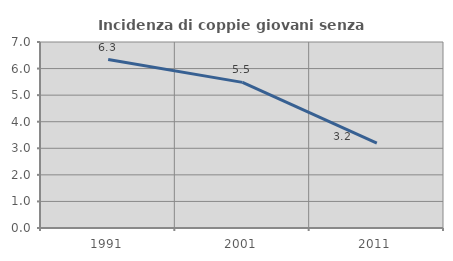
| Category | Incidenza di coppie giovani senza figli |
|---|---|
| 1991.0 | 6.341 |
| 2001.0 | 5.481 |
| 2011.0 | 3.199 |